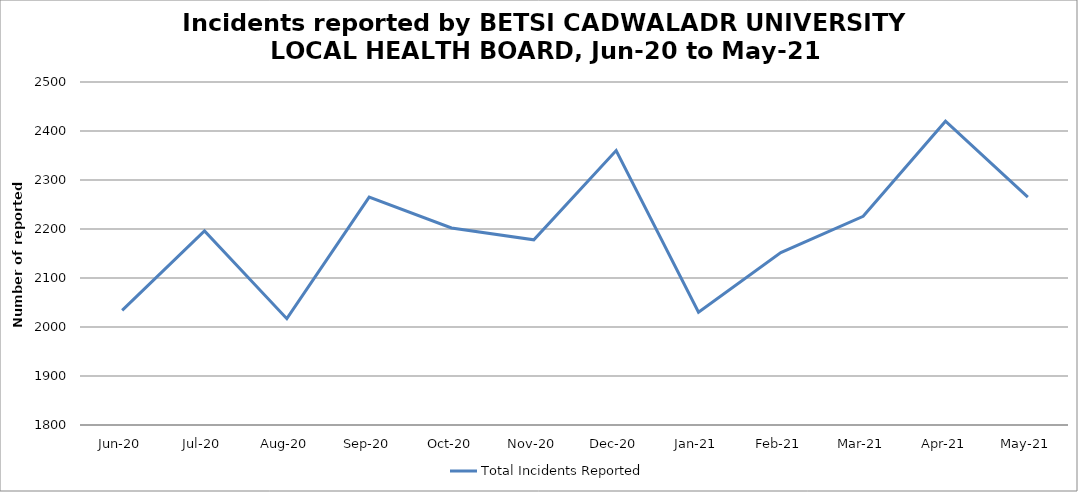
| Category | Total Incidents Reported |
|---|---|
| Jun-20 | 2034 |
| Jul-20 | 2196 |
| Aug-20 | 2017 |
| Sep-20 | 2265 |
| Oct-20 | 2202 |
| Nov-20 | 2178 |
| Dec-20 | 2360 |
| Jan-21 | 2030 |
| Feb-21 | 2152 |
| Mar-21 | 2226 |
| Apr-21 | 2420 |
| May-21 | 2265 |